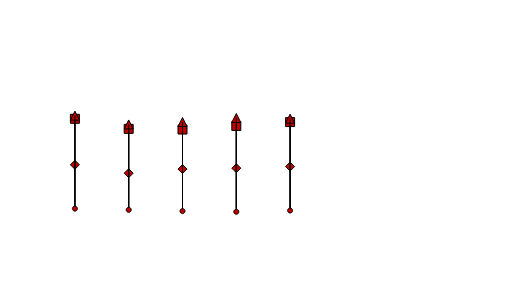
| Category | Lehr-/Anlernausbildung1) | Fachschulabschluss2) | Fachhochschul- und Hochschulabschluss3) | Ohne beruflichen Bildungsabschluss |
|---|---|---|---|---|
| 0 | 36.688 | 53.85 | 55.029 | 20.302 |
| 1 | 33.546 | 50.089 | 51.739 | 19.856 |
| 2 | 35.065 | 49.84 | 52.646 | 19.382 |
| 3 | 35.418 | 51.176 | 54.14 | 19.14 |
| 4 | 36.017 | 52.635 | 53.898 | 19.591 |